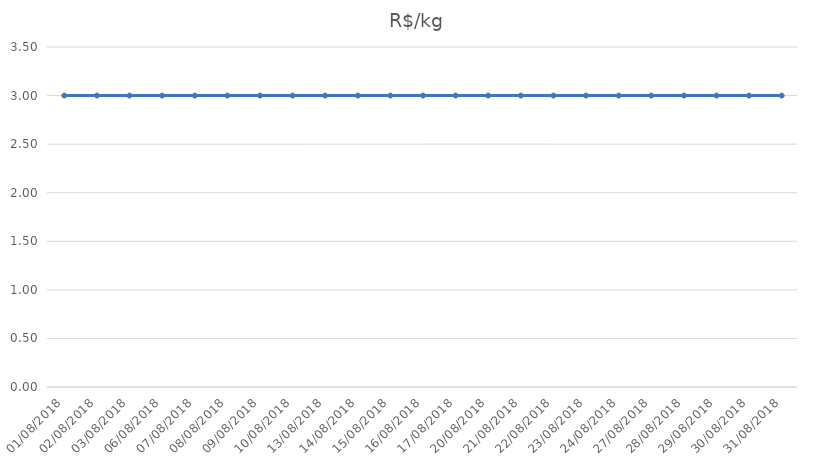
| Category | R$/kg |
|---|---|
| 01/08/2018 | 3 |
| 02/08/2018 | 3 |
| 03/08/2018 | 3 |
| 06/08/2018 | 3 |
| 07/08/2018 | 3 |
| 08/08/2018 | 3 |
| 09/08/2018 | 3 |
| 10/08/2018 | 3 |
| 13/08/2018 | 3 |
| 14/08/2018 | 3 |
| 15/08/2018 | 3 |
| 16/08/2018 | 3 |
| 17/08/2018 | 3 |
| 20/08/2018 | 3 |
| 21/08/2018 | 3 |
| 22/08/2018 | 3 |
| 23/08/2018 | 3 |
| 24/08/2018 | 3 |
| 27/08/2018 | 3 |
| 28/08/2018 | 3 |
| 29/08/2018 | 3 |
| 30/08/2018 | 3 |
| 31/08/2018 | 3 |